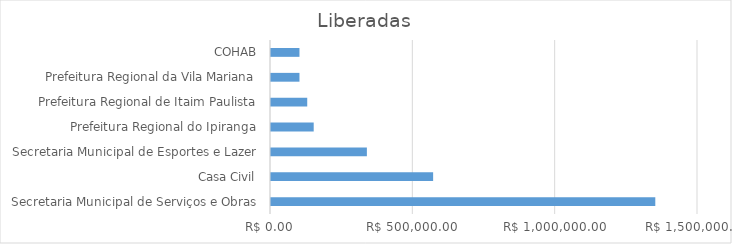
| Category | Series 0 |
|---|---|
| Secretaria Municipal de Serviços e Obras | 1350000 |
| Casa Civil | 569545 |
| Secretaria Municipal de Esportes e Lazer | 336818 |
| Prefeitura Regional do Ipiranga | 150000 |
| Prefeitura Regional de Itaim Paulista | 127272 |
| Prefeitura Regional da Vila Mariana | 100000 |
| COHAB | 100000 |